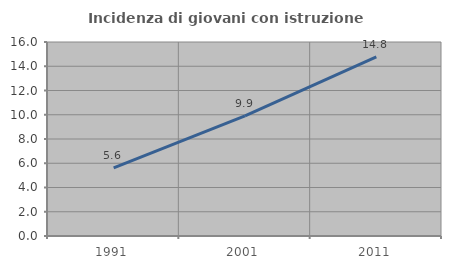
| Category | Incidenza di giovani con istruzione universitaria |
|---|---|
| 1991.0 | 5.611 |
| 2001.0 | 9.916 |
| 2011.0 | 14.777 |